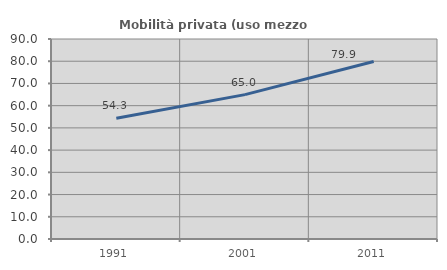
| Category | Mobilità privata (uso mezzo privato) |
|---|---|
| 1991.0 | 54.323 |
| 2001.0 | 64.959 |
| 2011.0 | 79.872 |